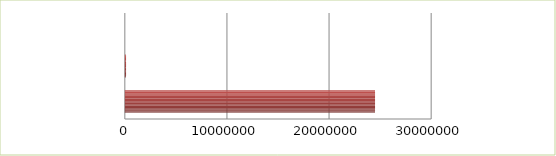
| Category | Series 0 | Series 1 |
|---|---|---|
| 0 | 2.5 | 24503661 |
| 1 | 2.6 | 120000 |
| 2 | 2.7 | 0 |